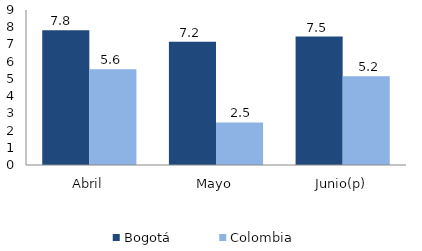
| Category | Bogotá | Colombia |
|---|---|---|
| Abril | 7.828 | 5.559 |
| Mayo | 7.155 | 2.47 |
| Junio(p) | 7.461 | 5.157 |